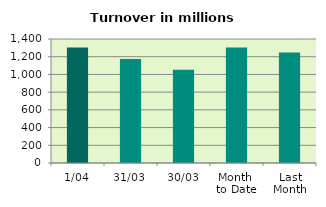
| Category | Series 0 |
|---|---|
| 1/04 | 1303.394 |
| 31/03 | 1173.639 |
| 30/03 | 1051.736 |
| Month 
to Date | 1303.394 |
| Last
Month | 1246.474 |